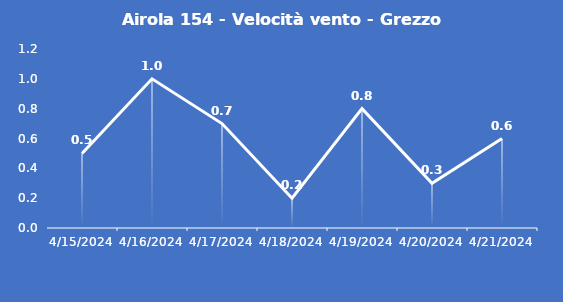
| Category | Airola 154 - Velocità vento - Grezzo (m/s) |
|---|---|
| 4/15/24 | 0.5 |
| 4/16/24 | 1 |
| 4/17/24 | 0.7 |
| 4/18/24 | 0.2 |
| 4/19/24 | 0.8 |
| 4/20/24 | 0.3 |
| 4/21/24 | 0.6 |